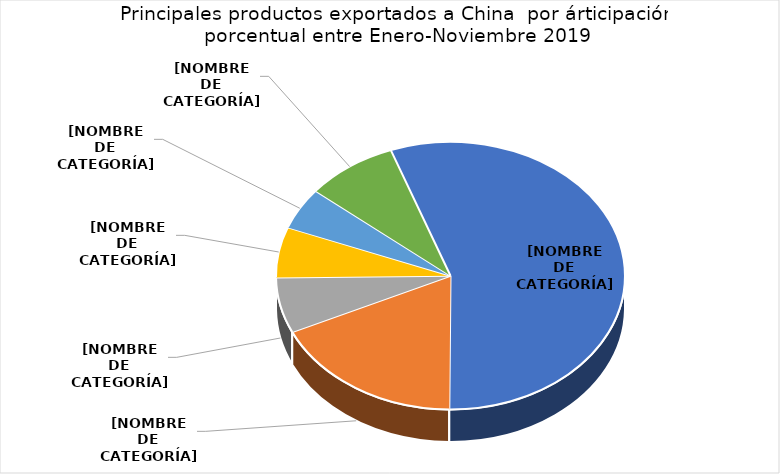
| Category | Series 0 |
|---|---|
| Harina de pescado. | 0.556 |
| Carne de animales de la especie bovina, deshuesada, congelada. | 0.18 |
| Los demás cortes (trozos) de carne de bovino sin deshuesar | 0.067 |
| Las demás maderas aserradas o desbastadas longitudinalmente | 0.061 |
| Café tostado, descafeinado. | 0.051 |
| 15 productos restantes | 0.085 |